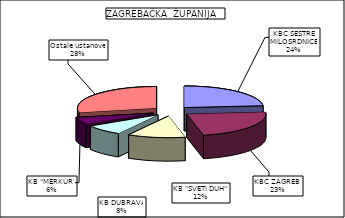
| Category | Series 0 |
|---|---|
| KBC SESTRE MILOSRDNICE | 23.607 |
| KBC ZAGREB  | 22.998 |
| KB "SVETI DUH" | 11.773 |
| KB DUBRAVA | 7.906 |
| KB "MERKUR" | 5.518 |
| Ostale ustanove | 28.199 |